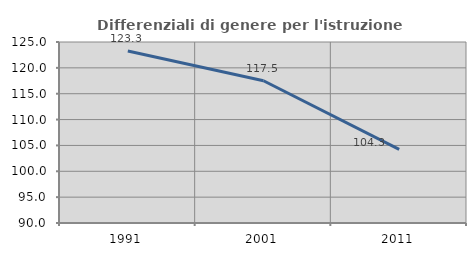
| Category | Differenziali di genere per l'istruzione superiore |
|---|---|
| 1991.0 | 123.265 |
| 2001.0 | 117.514 |
| 2011.0 | 104.252 |